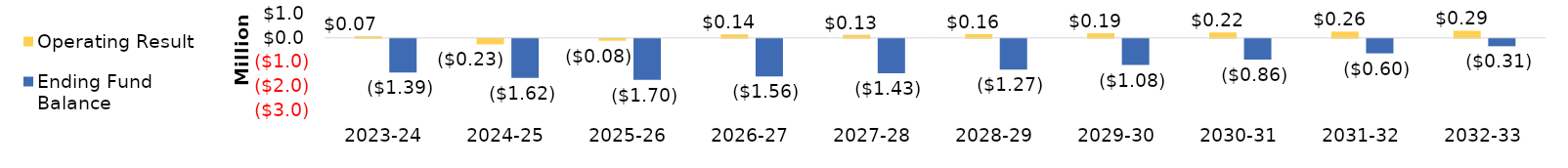
| Category | Operating Result | Ending Fund Balance |
|---|---|---|
| 2023-24 | 66455.258 | -1392285.742 |
| 2024-25 | -228435.355 | -1620721.096 |
| 2025-26 | -78245.406 | -1698966.503 |
| 2026-27 | 143966.071 | -1555000.431 |
| 2027-28 | 127025.015 | -1427975.416 |
| 2028-29 | 157908.342 | -1270067.074 |
| 2029-30 | 189112.128 | -1080954.947 |
| 2030-31 | 223246.743 | -857708.203 |
| 2031-32 | 257097.56 | -600610.643 |
| 2032-33 | 293178.195 | -307432.449 |